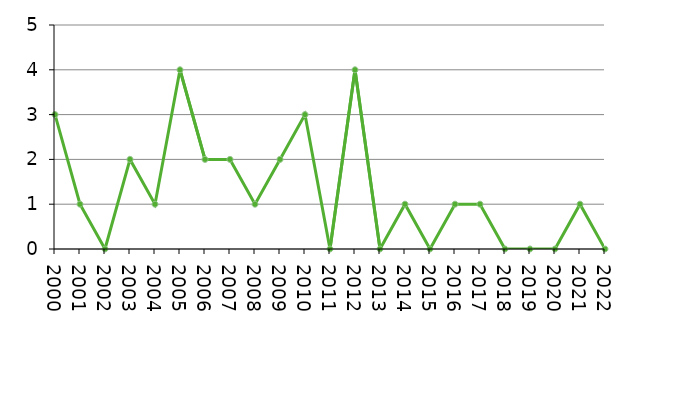
| Category | Avlidna |
|---|---|
| 2000 | 3 |
| 2001 | 1 |
| 2002 | 0 |
| 2003 | 2 |
| 2004 | 1 |
| 2005 | 4 |
| 2006 | 2 |
| 2007 | 2 |
| 2008 | 1 |
| 2009 | 2 |
| 2010 | 3 |
| 2011 | 0 |
| 2012 | 4 |
| 2013 | 0 |
| 2014 | 1 |
| 2015 | 0 |
| 2016 | 1 |
| 2017 | 1 |
| 2018 | 0 |
| 2019 | 0 |
| 2020 | 0 |
| 2021 | 1 |
| 2022 | 0 |